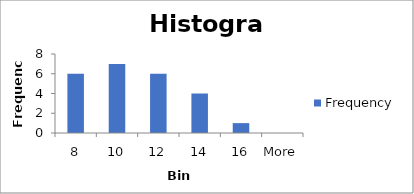
| Category | Frequency |
|---|---|
| 8 | 6 |
| 10 | 7 |
| 12 | 6 |
| 14 | 4 |
| 16 | 1 |
| More | 0 |